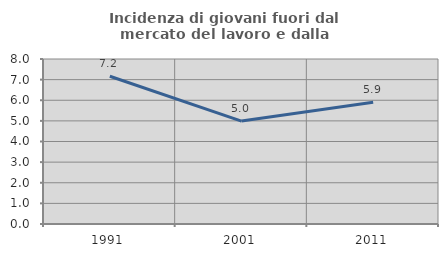
| Category | Incidenza di giovani fuori dal mercato del lavoro e dalla formazione  |
|---|---|
| 1991.0 | 7.163 |
| 2001.0 | 4.992 |
| 2011.0 | 5.904 |